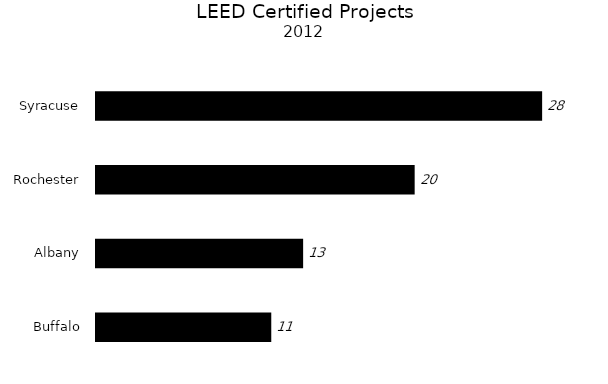
| Category | Series 0 |
|---|---|
| Buffalo | 11 |
| Albany | 13 |
| Rochester | 20 |
| Syracuse | 28 |